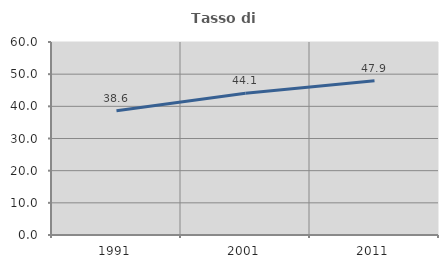
| Category | Tasso di occupazione   |
|---|---|
| 1991.0 | 38.616 |
| 2001.0 | 44.055 |
| 2011.0 | 47.934 |